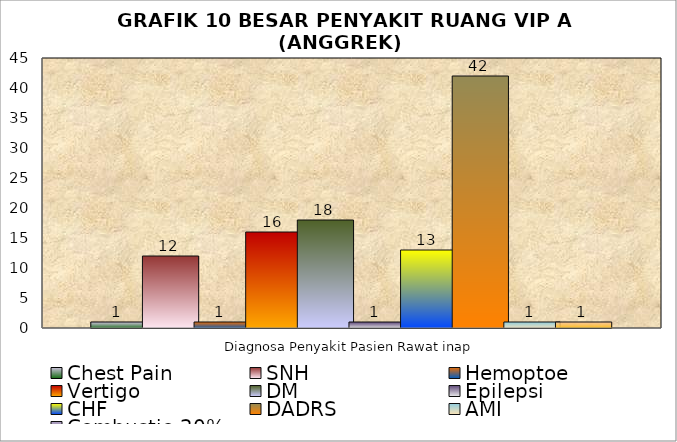
| Category | Chest Pain | SNH | Hemoptoe | Vertigo | DM | Epilepsi | CHF | DADRS | AMI | Combustio 20% |
|---|---|---|---|---|---|---|---|---|---|---|
| 0 | 1 | 12 | 1 | 16 | 18 | 1 | 13 | 42 | 1 | 1 |